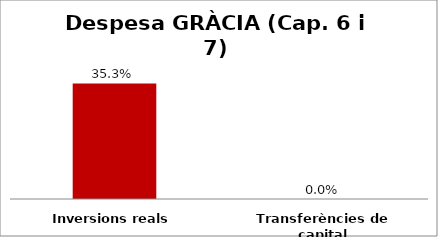
| Category | Series 0 |
|---|---|
| Inversions reals | 0.353 |
| Transferències de capital | 0 |